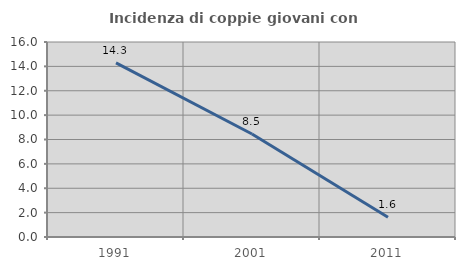
| Category | Incidenza di coppie giovani con figli |
|---|---|
| 1991.0 | 14.286 |
| 2001.0 | 8.451 |
| 2011.0 | 1.613 |